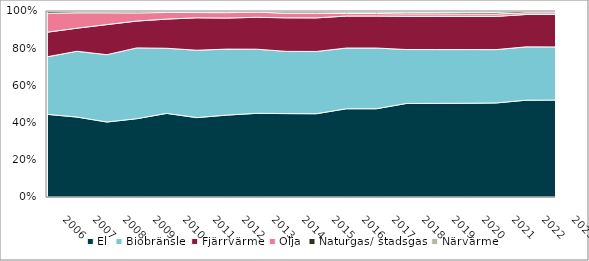
| Category | El | Biobränsle | Fjärrvärme | Olja | Naturgas/ stadsgas | Närvärme |
|---|---|---|---|---|---|---|
| 2006 | 0.447 | 0.311 | 0.133 | 0.103 | 0.009 | 0.003 |
| 2007 | 0.43 | 0.354 | 0.124 | 0.083 | 0.006 | 0.003 |
| 2008 | 0.403 | 0.362 | 0.162 | 0.063 | 0.006 | 0.003 |
| 2009 | 0.421 | 0.381 | 0.144 | 0.044 | 0.006 | 0.004 |
| 2010 | 0.45 | 0.35 | 0.157 | 0.036 | 0.006 | 0.002 |
| 2011 | 0.427 | 0.362 | 0.174 | 0.028 | 0.004 | 0.005 |
| 2012 | 0.44 | 0.355 | 0.167 | 0.029 | 0.005 | 0.004 |
| 2013 | 0.45 | 0.345 | 0.172 | 0.028 | 0.003 | 0.003 |
| 2014 | 0.448 | 0.335 | 0.18 | 0.024 | 0.008 | 0.005 |
| 2015 | 0.448 | 0.335 | 0.181 | 0.024 | 0.008 | 0.005 |
| 2016 | 0.475 | 0.326 | 0.172 | 0.013 | 0.008 | 0.006 |
| 2017 | 0.475 | 0.326 | 0.172 | 0.013 | 0.008 | 0.006 |
| 2018 | 0.503 | 0.29 | 0.179 | 0.013 | 0.009 | 0.007 |
| 2019 | 0.503 | 0.289 | 0.179 | 0.013 | 0.009 | 0.007 |
| 2020 | 0.504 | 0.289 | 0.179 | 0.013 | 0.009 | 0.007 |
| 2021 | 0.506 | 0.287 | 0.179 | 0.013 | 0.009 | 0.007 |
| 2022 | 0.52 | 0.287 | 0.174 | 0.01 | 0.008 | 0.002 |
| 2023 | 0.521 | 0.286 | 0.175 | 0.009 | 0.008 | 0.002 |